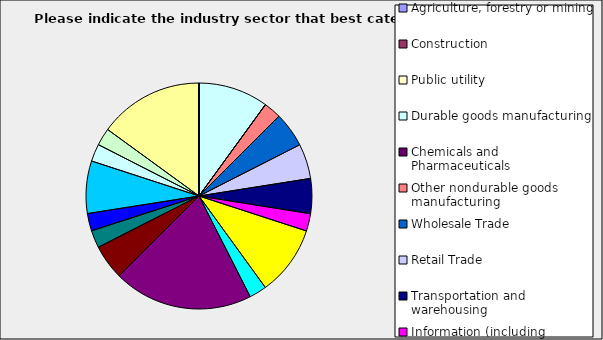
| Category | Series 0 |
|---|---|
| Agriculture, forestry or mining | 0 |
| Construction | 0 |
| Public utility | 0 |
| Durable goods manufacturing | 0.1 |
| Chemicals and Pharmaceuticals | 0 |
| Other nondurable goods manufacturing | 0.025 |
| Wholesale Trade | 0.05 |
| Retail Trade | 0.05 |
| Transportation and warehousing | 0.05 |
| Information (including broadcasting and telecommunication) | 0.025 |
| Finance and Insurance | 0.1 |
| Real Estate | 0.025 |
| Professional, scientific and technical services | 0.2 |
| Consulting | 0.05 |
| Administrative and office services (including waste management) | 0.025 |
| Education | 0.025 |
| Health Care and social services | 0.075 |
| Arts, entertainment and recreation | 0.025 |
| Accommodation and food services | 0.025 |
| Other | 0.15 |